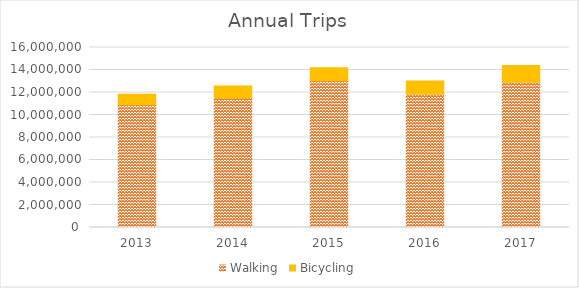
| Category | Walking | Bicycling |
|---|---|---|
| 2013 | 10917365.517 | 928918.864 |
| 2014 | 11497406.031 | 1082845.149 |
| 2015 | 13046424.766 | 1153243.306 |
| 2016 | 11837809.268 | 1192541.68 |
| 2017 | 12913393.574 | 1493551.209 |